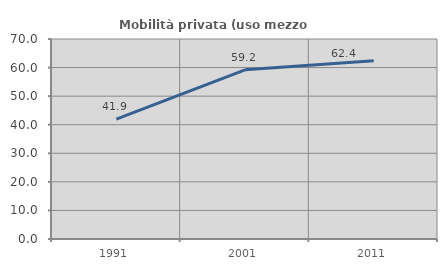
| Category | Mobilità privata (uso mezzo privato) |
|---|---|
| 1991.0 | 41.94 |
| 2001.0 | 59.21 |
| 2011.0 | 62.361 |